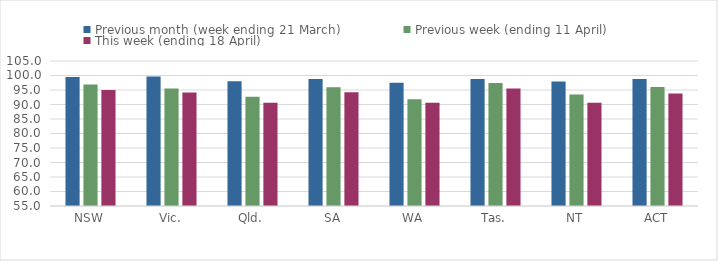
| Category | Previous month (week ending 21 March) | Previous week (ending 11 April) | This week (ending 18 April) |
|---|---|---|---|
| NSW | 99.446 | 96.938 | 95.036 |
| Vic. | 99.674 | 95.494 | 94.13 |
| Qld. | 98.009 | 92.678 | 90.599 |
| SA | 98.83 | 95.988 | 94.259 |
| WA | 97.467 | 91.821 | 90.569 |
| Tas. | 98.798 | 97.377 | 95.557 |
| NT | 97.904 | 93.413 | 90.572 |
| ACT | 98.817 | 96.055 | 93.76 |